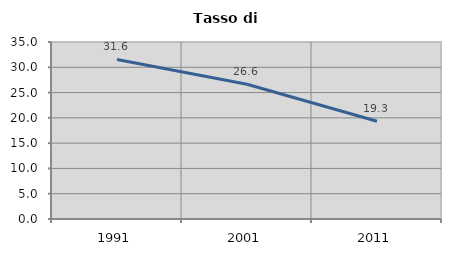
| Category | Tasso di disoccupazione   |
|---|---|
| 1991.0 | 31.558 |
| 2001.0 | 26.648 |
| 2011.0 | 19.317 |